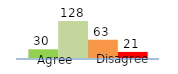
| Category | Series 0 | Series 1 | Series 2 | Series 3 |
|---|---|---|---|---|
| 0 | 30 | 128 | 63 | 21 |